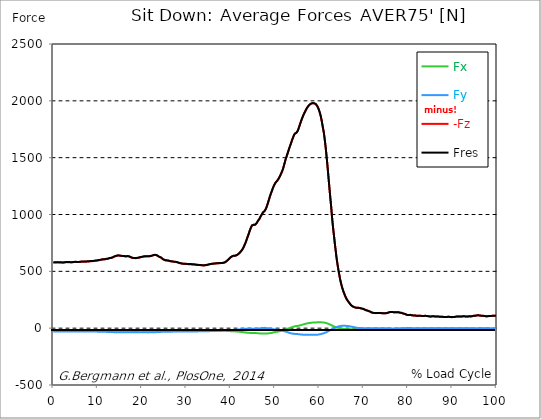
| Category |  Fx |  Fy |  -Fz |  Fres |
|---|---|---|---|---|
| 0.0 | -23.135 | -29.291 | 578.853 | 580.077 |
| 0.167348456675344 | -23.206 | -29.258 | 578.73 | 579.949 |
| 0.334696913350688 | -23.167 | -29.246 | 578.356 | 579.575 |
| 0.5020453700260321 | -23.077 | -29.213 | 578.099 | 579.31 |
| 0.669393826701376 | -22.89 | -29.162 | 578.066 | 579.272 |
| 0.83674228337672 | -23.167 | -29.033 | 578.988 | 580.193 |
| 1.0040907400520642 | -23.541 | -29.11 | 579.175 | 580.4 |
| 1.1621420602454444 | -23.322 | -29.265 | 578.279 | 579.51 |
| 1.3294905169207885 | -23.418 | -29.284 | 577.989 | 579.22 |
| 1.4968389735961325 | -23.444 | -29.188 | 577.892 | 579.123 |
| 1.6641874302714765 | -23.47 | -29.2 | 577.931 | 579.156 |
| 1.8315358869468206 | -23.464 | -29.355 | 577.802 | 579.04 |
| 1.9988843436221646 | -23.302 | -29.51 | 577.119 | 578.356 |
| 2.1662328002975086 | -23.257 | -29.4 | 577.138 | 578.369 |
| 2.333581256972853 | -23.238 | -29.258 | 577.241 | 578.46 |
| 2.5009297136481967 | -23.257 | -29.104 | 578.273 | 579.484 |
| 2.6682781703235405 | -23.277 | -28.949 | 579.317 | 580.522 |
| 2.8356266269988843 | -23.425 | -28.91 | 580.226 | 581.431 |
| 3.002975083674229 | -23.638 | -28.923 | 581.07 | 582.282 |
| 3.1703235403495724 | -23.592 | -28.91 | 581.238 | 582.45 |
| 3.337671997024917 | -23.431 | -28.904 | 580.754 | 581.96 |
| 3.4957233172182973 | -23.386 | -28.794 | 580.322 | 581.521 |
| 3.663071773893641 | -23.315 | -28.769 | 579.91 | 581.102 |
| 3.8304202305689854 | -23.186 | -28.704 | 579.562 | 580.748 |
| 3.997768687244329 | -23.057 | -28.582 | 579.336 | 580.509 |
| 4.165117143919673 | -23.019 | -28.517 | 579.414 | 580.587 |
| 4.332465600595017 | -23.083 | -28.53 | 579.91 | 581.083 |
| 4.499814057270361 | -23.193 | -28.562 | 580.567 | 581.747 |
| 4.667162513945706 | -23.393 | -28.627 | 581.644 | 582.83 |
| 4.834510970621049 | -23.592 | -28.691 | 582.72 | 583.919 |
| 5.001859427296393 | -23.644 | -28.794 | 583.107 | 584.313 |
| 5.169207883971737 | -23.567 | -28.943 | 582.617 | 583.823 |
| 5.336556340647081 | -23.264 | -29.007 | 581.67 | 582.869 |
| 5.503904797322425 | -22.967 | -29.007 | 581.089 | 582.282 |
| 5.671253253997769 | -22.954 | -29.039 | 581.496 | 582.688 |
| 5.82930457419115 | -22.909 | -29.014 | 582.011 | 583.197 |
| 5.996653030866494 | -22.89 | -28.962 | 582.662 | 583.842 |
| 6.164001487541838 | -23.032 | -28.788 | 583.977 | 585.157 |
| 6.331349944217181 | -23.322 | -28.775 | 585.144 | 586.33 |
| 6.498698400892526 | -23.412 | -29.039 | 585.131 | 586.33 |
| 6.66604685756787 | -23.244 | -29.194 | 584.545 | 585.744 |
| 6.833395314243213 | -23.386 | -29.136 | 585.138 | 586.343 |
| 7.000743770918558 | -23.612 | -29.226 | 585.698 | 586.917 |
| 7.168092227593902 | -23.335 | -29.478 | 585.144 | 586.362 |
| 7.335440684269246 | -22.967 | -29.568 | 584.764 | 585.976 |
| 7.50278914094459 | -22.999 | -29.4 | 585.93 | 587.129 |
| 7.6701375976199335 | -23.347 | -29.323 | 587.013 | 588.225 |
| 7.837486054295278 | -23.212 | -29.413 | 586.852 | 588.058 |
| 7.995537374488658 | -22.722 | -29.439 | 586.407 | 587.6 |
| 8.162885831164003 | -22.503 | -29.342 | 587.187 | 588.361 |
| 8.330234287839346 | -22.716 | -29.297 | 589.192 | 590.372 |
| 8.49758274451469 | -22.941 | -29.31 | 589.888 | 591.074 |
| 8.664931201190035 | -22.6 | -29.452 | 589.521 | 590.701 |
| 8.832279657865378 | -22.097 | -29.6 | 589.366 | 590.533 |
| 8.999628114540721 | -22.033 | -29.632 | 590.314 | 591.48 |
| 9.166976571216066 | -22.548 | -29.652 | 592.015 | 593.202 |
| 9.334325027891412 | -22.735 | -29.884 | 592.815 | 594.02 |
| 9.501673484566755 | -22.406 | -30.187 | 592.97 | 594.181 |
| 9.669021941242098 | -22.149 | -30.341 | 593.434 | 594.639 |
| 9.836370397917442 | -22.284 | -30.387 | 594.742 | 595.954 |
| 10.003718854592787 | -22.619 | -30.496 | 596.341 | 597.572 |
| 10.17106731126813 | -22.916 | -30.786 | 597.43 | 598.681 |
| 10.329118631461512 | -22.961 | -31.167 | 597.965 | 599.241 |
| 10.496467088136853 | -22.651 | -31.515 | 598.694 | 599.983 |
| 10.663815544812199 | -22.574 | -31.663 | 600.795 | 602.084 |
| 10.831164001487544 | -22.677 | -31.76 | 603 | 604.295 |
| 10.998512458162887 | -22.658 | -32.101 | 603.87 | 605.185 |
| 11.16586091483823 | -22.374 | -32.269 | 604.037 | 605.359 |
| 11.333209371513574 | -22.31 | -32.449 | 604.85 | 606.171 |
| 11.50055782818892 | -22.342 | -32.552 | 604.682 | 606.016 |
| 11.667906284864264 | -22.161 | -32.365 | 605.849 | 607.164 |
| 11.835254741539607 | -22.419 | -32.327 | 607.724 | 609.039 |
| 12.00260319821495 | -22.638 | -32.72 | 609.265 | 610.612 |
| 12.169951654890292 | -22.303 | -33.158 | 609.31 | 610.67 |
| 12.337300111565641 | -22 | -33.371 | 610.496 | 611.856 |
| 12.504648568240984 | -22.174 | -33.532 | 613.532 | 614.905 |
| 12.662699888434362 | -22.335 | -33.842 | 616.046 | 617.439 |
| 12.830048345109708 | -22.381 | -34.106 | 617.091 | 618.502 |
| 12.997396801785053 | -22.013 | -34.138 | 617.29 | 618.689 |
| 13.164745258460396 | -21.974 | -34.19 | 619.469 | 620.868 |
| 13.33209371513574 | -21.962 | -34.454 | 621.061 | 622.473 |
| 13.499442171811083 | -21.865 | -34.718 | 623.936 | 625.361 |
| 13.666790628486426 | -21.665 | -34.912 | 627.952 | 629.37 |
| 13.834139085161771 | -21.826 | -35.015 | 631.51 | 632.935 |
| 14.001487541837117 | -21.839 | -35.318 | 633.296 | 634.733 |
| 14.16883599851246 | -21.71 | -35.601 | 635.139 | 636.583 |
| 14.336184455187803 | -21.736 | -35.814 | 636.964 | 638.42 |
| 14.503532911863147 | -22.103 | -35.763 | 638.891 | 640.361 |
| 14.670881368538492 | -22.277 | -35.627 | 639.484 | 640.954 |
| 14.828932688731873 | -22.161 | -35.55 | 638.936 | 640.399 |
| 14.996281145407215 | -22.245 | -35.479 | 637.312 | 638.775 |
| 15.163629602082558 | -22.194 | -35.485 | 636.719 | 638.182 |
| 15.330978058757903 | -22.265 | -35.601 | 635.249 | 636.719 |
| 15.498326515433247 | -22.045 | -35.518 | 633.689 | 635.159 |
| 15.665674972108594 | -22.335 | -35.163 | 634.114 | 635.578 |
| 15.833023428783937 | -22.638 | -35.131 | 634.359 | 635.829 |
| 16.00037188545928 | -22.735 | -35.286 | 633.302 | 634.785 |
| 16.167720342134626 | -22.716 | -35.369 | 631.852 | 633.341 |
| 16.335068798809967 | -22.49 | -35.279 | 630.859 | 632.342 |
| 16.502417255485312 | -22.664 | -35.021 | 631.626 | 633.096 |
| 16.669765712160658 | -23.07 | -34.995 | 632.471 | 633.947 |
| 16.837114168836 | -23.315 | -35.028 | 632.342 | 633.837 |
| 17.004462625511344 | -23.618 | -34.995 | 632.09 | 633.599 |
| 17.16251394570472 | -23.76 | -35.318 | 629.647 | 631.175 |
| 17.32986240238007 | -23.58 | -35.659 | 626.154 | 627.694 |
| 17.497210859055414 | -23.399 | -35.995 | 622.641 | 624.2 |
| 17.664559315730756 | -23.302 | -36.207 | 620.165 | 621.725 |
| 17.8319077724061 | -23.824 | -36.201 | 618.077 | 619.662 |
| 17.999256229081443 | -24.115 | -36.233 | 616.549 | 618.154 |
| 18.166604685756788 | -24.134 | -36.285 | 616.794 | 618.406 |
| 18.333953142432133 | -24.205 | -36.265 | 616.207 | 617.825 |
| 18.501301599107478 | -24.089 | -36.098 | 615.84 | 617.439 |
| 18.668650055782823 | -24.057 | -36.001 | 615.827 | 617.426 |
| 18.835998512458165 | -24.024 | -35.949 | 616.459 | 618.045 |
| 19.00334696913351 | -23.799 | -35.982 | 617.593 | 619.173 |
| 19.170695425808855 | -23.496 | -36.201 | 618.702 | 620.281 |
| 19.338043882484197 | -23.238 | -36.394 | 619.965 | 621.538 |
| 19.496095202677576 | -23.302 | -36.42 | 622.473 | 624.046 |
| 19.66344365935292 | -23.464 | -36.517 | 624.355 | 625.934 |
| 19.830792116028263 | -23.154 | -36.768 | 625.29 | 626.869 |
| 19.998140572703612 | -22.767 | -36.671 | 626.347 | 627.894 |
| 20.165489029378953 | -22.742 | -36.51 | 628.3 | 629.834 |
| 20.3328374860543 | -22.709 | -36.459 | 629.963 | 631.497 |
| 20.500185942729644 | -22.49 | -36.491 | 631.059 | 632.587 |
| 20.667534399404985 | -22.252 | -36.742 | 630.447 | 631.981 |
| 20.83488285608033 | -22.026 | -36.858 | 630.647 | 632.168 |
| 21.002231312755672 | -22.11 | -36.775 | 632.271 | 633.792 |
| 21.16957976943102 | -22.271 | -36.8 | 632.961 | 634.488 |
| 21.336928226106362 | -22.194 | -37.058 | 632.226 | 633.766 |
| 21.504276682781704 | -21.962 | -37.174 | 631.169 | 632.709 |
| 21.67162513945705 | -21.916 | -36.987 | 631.781 | 633.309 |
| 21.82967645965043 | -22.219 | -36.768 | 633.347 | 634.869 |
| 21.997024916325774 | -22.297 | -36.82 | 634.23 | 635.745 |
| 22.16437337300112 | -22.632 | -36.697 | 635.629 | 637.151 |
| 22.33172182967646 | -22.819 | -36.497 | 638.221 | 639.735 |
| 22.499070286351806 | -22.819 | -36.31 | 641.186 | 642.688 |
| 22.666418743027148 | -22.593 | -35.988 | 643.004 | 644.48 |
| 22.833767199702496 | -22.477 | -35.924 | 643.468 | 644.937 |
| 23.00111565637784 | -22.587 | -35.363 | 643.674 | 645.124 |
| 23.168464113053183 | -22.6 | -34.905 | 643.165 | 644.602 |
| 23.335812569728528 | -22.497 | -34.615 | 640.786 | 642.217 |
| 23.50316102640387 | -22.413 | -34.267 | 637.621 | 639.046 |
| 23.670509483079215 | -22.239 | -33.751 | 632.026 | 633.425 |
| 23.83785793975456 | -21.936 | -33.494 | 628.042 | 629.422 |
| 23.995909259947936 | -22.2 | -33.081 | 624.903 | 626.283 |
| 24.163257716623285 | -22.632 | -32.9 | 622.956 | 624.349 |
| 24.330606173298627 | -22.684 | -32.656 | 619.521 | 620.919 |
| 24.49795462997397 | -22.529 | -32.237 | 613.474 | 614.86 |
| 24.665303086649313 | -22.426 | -31.785 | 607.48 | 608.853 |
| 24.83265154332466 | -22.51 | -31.418 | 603.799 | 605.159 |
| 25.0 | -22.78 | -31.244 | 601.208 | 602.568 |
| 25.167348456675345 | -22.935 | -31.173 | 597.836 | 599.203 |
| 25.334696913350694 | -22.974 | -31.231 | 595.548 | 596.921 |
| 25.502045370026035 | -23.161 | -31.089 | 594.936 | 596.309 |
| 25.669393826701377 | -23.238 | -31.134 | 594.987 | 596.367 |
| 25.836742283376722 | -23.399 | -31.121 | 594.594 | 595.986 |
| 26.004090740052067 | -23.393 | -31.096 | 593.272 | 594.658 |
| 26.17143919672741 | -23.315 | -31.147 | 590.868 | 592.254 |
| 26.329490516920792 | -23.257 | -31.128 | 588.689 | 590.082 |
| 26.49683897359613 | -23.219 | -30.87 | 587.626 | 589.005 |
| 26.66418743027148 | -23.283 | -30.702 | 586.936 | 588.309 |
| 26.831535886946828 | -23.367 | -30.593 | 586.298 | 587.664 |
| 26.998884343622166 | -23.483 | -30.361 | 585.447 | 586.814 |
| 27.166232800297514 | -23.541 | -30.283 | 584.158 | 585.524 |
| 27.333581256972852 | -23.496 | -30.341 | 583.159 | 584.532 |
| 27.5009297136482 | -23.625 | -30.432 | 582.643 | 584.029 |
| 27.668278170323543 | -23.728 | -30.483 | 581.947 | 583.333 |
| 27.835626626998888 | -23.696 | -30.445 | 580.625 | 582.011 |
| 28.002975083674233 | -23.67 | -30.374 | 578.911 | 580.29 |
| 28.170323540349575 | -23.65 | -30.264 | 576.784 | 578.163 |
| 28.33767199702492 | -23.438 | -30.167 | 573.973 | 575.34 |
| 28.50502045370026 | -23.412 | -29.935 | 571.994 | 573.348 |
| 28.663071773893645 | -23.592 | -29.723 | 570.615 | 571.968 |
| 28.830420230568986 | -23.644 | -29.71 | 569.068 | 570.421 |
| 28.99776868724433 | -23.605 | -29.684 | 567.701 | 569.055 |
| 29.165117143919673 | -23.496 | -29.639 | 566.47 | 567.824 |
| 29.33246560059502 | -23.483 | -29.594 | 565.967 | 567.314 |
| 29.499814057270367 | -23.515 | -29.516 | 565.754 | 567.102 |
| 29.66716251394571 | -23.58 | -29.375 | 565.606 | 566.947 |
| 29.834510970621054 | -23.663 | -29.323 | 565.335 | 566.683 |
| 30.00185942729639 | -23.741 | -29.291 | 565.039 | 566.386 |
| 30.169207883971744 | -23.766 | -29.329 | 563.924 | 565.284 |
| 30.33655634064708 | -23.779 | -29.342 | 562.918 | 564.278 |
| 30.50390479732243 | -23.792 | -29.304 | 562.306 | 563.666 |
| 30.671253253997772 | -23.844 | -29.246 | 562.022 | 563.376 |
| 30.829304574191156 | -23.96 | -29.142 | 562.183 | 563.537 |
| 30.996653030866494 | -24.069 | -29.046 | 562.351 | 563.698 |
| 31.164001487541842 | -24.211 | -28.936 | 561.648 | 562.996 |
| 31.331349944217187 | -24.34 | -28.833 | 560.926 | 562.28 |
| 31.498698400892525 | -24.36 | -28.846 | 560.63 | 561.983 |
| 31.666046857567874 | -24.379 | -28.859 | 560.333 | 561.687 |
| 31.833395314243212 | -24.379 | -28.852 | 559.889 | 561.242 |
| 32.00074377091856 | -24.327 | -28.756 | 558.922 | 560.269 |
| 32.1680922275939 | -24.276 | -28.659 | 557.955 | 559.295 |
| 32.33544068426925 | -24.237 | -28.504 | 556.923 | 558.258 |
| 32.50278914094459 | -24.237 | -28.266 | 555.808 | 557.123 |
| 32.670137597619934 | -24.418 | -28.072 | 555.634 | 556.949 |
| 32.83748605429528 | -24.598 | -27.885 | 555.46 | 556.782 |
| 33.004834510970625 | -24.759 | -27.718 | 555.189 | 556.511 |
| 33.162885831164004 | -24.837 | -27.705 | 554.39 | 555.718 |
| 33.33023428783935 | -24.907 | -27.686 | 553.597 | 554.919 |
| 33.497582744514695 | -24.978 | -27.673 | 552.798 | 554.126 |
| 33.664931201190036 | -24.94 | -27.634 | 552.392 | 553.713 |
| 33.83227965786538 | -24.83 | -27.589 | 552.192 | 553.507 |
| 33.99962811454073 | -24.727 | -27.544 | 551.992 | 553.301 |
| 34.16697657121607 | -24.624 | -27.454 | 552.34 | 553.629 |
| 34.33432502789141 | -24.521 | -27.305 | 553.668 | 554.944 |
| 34.50167348456676 | -24.411 | -27.151 | 554.996 | 556.253 |
| 34.6690219412421 | -24.501 | -26.906 | 556.285 | 557.529 |
| 34.83637039791744 | -24.682 | -26.616 | 557.555 | 558.786 |
| 35.00371885459279 | -24.791 | -26.371 | 559.115 | 560.333 |
| 35.17106731126814 | -24.804 | -26.177 | 561.094 | 562.293 |
| 35.338415767943474 | -24.785 | -25.965 | 562.725 | 563.904 |
| 35.49646708813686 | -24.727 | -25.745 | 564.098 | 565.258 |
| 35.6638155448122 | -24.566 | -25.539 | 565.29 | 566.431 |
| 35.831164001487544 | -24.269 | -25.281 | 565.89 | 567.005 |
| 35.998512458162885 | -23.973 | -25.023 | 566.502 | 567.585 |
| 36.165860914838234 | -23.689 | -24.798 | 567.334 | 568.397 |
| 36.333209371513576 | -23.502 | -24.592 | 567.978 | 569.023 |
| 36.50055782818892 | -23.393 | -24.398 | 568.513 | 569.545 |
| 36.667906284864266 | -23.27 | -24.192 | 569.39 | 570.402 |
| 36.83525474153961 | -23.09 | -24.011 | 569.783 | 570.782 |
| 37.002603198214956 | -23.09 | -23.689 | 570.415 | 571.395 |
| 37.1699516548903 | -23.103 | -23.354 | 571.066 | 572.026 |
| 37.337300111565646 | -23.109 | -23.077 | 571.408 | 572.355 |
| 37.50464856824098 | -23.122 | -22.812 | 571.678 | 572.613 |
| 37.66269988843437 | -22.987 | -22.516 | 571.955 | 572.871 |
| 37.83004834510971 | -22.825 | -22.207 | 572.155 | 573.058 |
| 37.99739680178505 | -22.78 | -21.865 | 572.851 | 573.735 |
| 38.16474525846039 | -22.819 | -21.53 | 573.986 | 574.856 |
| 38.33209371513574 | -22.806 | -21.485 | 574.579 | 575.443 |
| 38.49944217181109 | -22.8 | -21.478 | 575.224 | 576.087 |
| 38.666790628486424 | -23.077 | -21.323 | 577.828 | 578.698 |
| 38.83413908516178 | -23.451 | -21.13 | 581.489 | 582.359 |
| 39.001487541837115 | -23.986 | -20.711 | 586.652 | 587.529 |
| 39.16883599851246 | -24.546 | -20.124 | 591.945 | 592.821 |
| 39.336184455187805 | -24.914 | -19.738 | 597.985 | 598.861 |
| 39.503532911863154 | -25.288 | -19.274 | 603.96 | 604.824 |
| 39.670881368538495 | -25.713 | -18.687 | 610.064 | 610.928 |
| 39.83822982521384 | -26.074 | -18.461 | 616.581 | 617.445 |
| 39.996281145407224 | -26.306 | -17.92 | 623.388 | 624.239 |
| 40.163629602082565 | -26.68 | -17.282 | 628.481 | 629.325 |
| 40.33097805875791 | -27.06 | -16.695 | 631.974 | 632.806 |
| 40.498326515433256 | -27.286 | -16.134 | 634.733 | 635.558 |
| 40.6656749721086 | -27.434 | -15.561 | 636.558 | 637.376 |
| 40.83302342878393 | -27.57 | -15 | 636.235 | 637.041 |
| 41.00037188545929 | -28.04 | -14.439 | 637.047 | 637.86 |
| 41.16772034213463 | -28.549 | -13.717 | 639.291 | 640.116 |
| 41.33506879880997 | -28.723 | -13.434 | 641.289 | 642.12 |
| 41.50241725548531 | -29.226 | -12.866 | 645.086 | 645.93 |
| 41.66976571216066 | -29.864 | -12.273 | 649.656 | 650.52 |
| 41.837114168836 | -30.748 | -11.513 | 655.348 | 656.237 |
| 42.004462625511344 | -31.534 | -10.862 | 661.272 | 662.187 |
| 42.17181108218669 | -32.172 | -10.262 | 667.647 | 668.568 |
| 42.32986240238007 | -32.778 | -9.418 | 675.84 | 676.768 |
| 42.497210859055414 | -33.377 | -8.483 | 683.736 | 684.664 |
| 42.66455931573076 | -34.151 | -7.735 | 693.237 | 694.178 |
| 42.831907772406105 | -35.273 | -7.123 | 704.982 | 705.962 |
| 42.999256229081446 | -36.484 | -6.672 | 719.073 | 720.091 |
| 43.16660468575679 | -37.516 | -6.253 | 734.157 | 735.201 |
| 43.33395314243214 | -38.283 | -5.866 | 748.68 | 749.743 |
| 43.50130159910748 | -39.127 | -5.724 | 766.529 | 767.612 |
| 43.66865005578282 | -39.907 | -5.776 | 785.1 | 786.202 |
| 43.83599851245817 | -40.365 | -5.479 | 803.819 | 804.908 |
| 44.00334696913351 | -40.913 | -5.324 | 820.972 | 822.074 |
| 44.17069542580886 | -41.461 | -5.376 | 840.922 | 842.024 |
| 44.3380438824842 | -41.802 | -5.408 | 860.57 | 861.659 |
| 44.49609520267758 | -41.886 | -5.324 | 876.807 | 877.877 |
| 44.66344365935292 | -41.699 | -5.047 | 892.761 | 893.805 |
| 44.83079211602827 | -41.674 | -4.951 | 903.822 | 904.854 |
| 44.99814057270361 | -42.041 | -4.931 | 909.218 | 910.256 |
| 45.16548902937895 | -42.118 | -4.718 | 908.812 | 909.849 |
| 45.332837486054295 | -42.395 | -4.351 | 907.2 | 908.244 |
| 45.500185942729644 | -42.731 | -4.28 | 908.902 | 909.953 |
| 45.66753439940499 | -43.092 | -4.306 | 912.886 | 913.949 |
| 45.83488285608033 | -43.343 | -4.345 | 922.542 | 923.612 |
| 46.00223131275568 | -44.194 | -4.699 | 933.158 | 934.254 |
| 46.16957976943102 | -44.839 | -4.403 | 943.968 | 945.09 |
| 46.336928226106366 | -45.554 | -3.687 | 951.51 | 952.658 |
| 46.50427668278171 | -46.115 | -2.617 | 961.456 | 962.636 |
| 46.671625139457056 | -46.347 | -1.528 | 975.451 | 976.643 |
| 46.829676459650436 | -46.476 | -0.348 | 987.614 | 988.839 |
| 46.99702491632577 | -46.656 | 0.922 | 998.089 | 999.346 |
| 47.16437337300112 | -46.695 | 1.992 | 1009.202 | 1010.478 |
| 47.33172182967646 | -46.727 | 2.424 | 1019.245 | 1020.528 |
| 47.49907028635181 | -46.888 | 2.598 | 1024.698 | 1025.981 |
| 47.66641874302716 | -47.12 | 2.617 | 1030.351 | 1031.621 |
| 47.83376719970249 | -47.359 | 1.876 | 1041.664 | 1042.921 |
| 48.001115656377834 | -47.481 | 0.844 | 1054.498 | 1055.723 |
| 48.16846411305319 | -47.372 | -0.316 | 1072.109 | 1073.308 |
| 48.33581256972853 | -46.637 | -1.186 | 1092.207 | 1093.348 |
| 48.50316102640387 | -45.715 | -2.005 | 1112.635 | 1113.705 |
| 48.67050948307921 | -44.664 | -2.946 | 1134.293 | 1135.312 |
| 48.837857939754564 | -44.001 | -4.08 | 1155.894 | 1156.887 |
| 49.005206396429905 | -43.317 | -5.756 | 1175.6 | 1176.547 |
| 49.163257716623285 | -42.26 | -7.29 | 1193.358 | 1194.241 |
| 49.33060617329863 | -40.977 | -8.702 | 1210.079 | 1210.892 |
| 49.49795462997397 | -39.334 | -9.585 | 1229.617 | 1230.378 |
| 49.66530308664932 | -37.368 | -10.107 | 1245.346 | 1246.048 |
| 49.832651543324666 | -35.679 | -10.513 | 1259.159 | 1259.81 |
| 50.0 | -34.273 | -10.913 | 1272.651 | 1273.27 |
| 50.16734845667534 | -33.268 | -11.145 | 1281.495 | 1282.088 |
| 50.33469691335069 | -32.359 | -11.351 | 1288.521 | 1289.088 |
| 50.50204537002604 | -31.373 | -11.983 | 1296.669 | 1297.204 |
| 50.66939382670139 | -30.122 | -12.847 | 1305.951 | 1306.454 |
| 50.836742283376715 | -28.588 | -13.956 | 1316.465 | 1316.922 |
| 51.00409074005207 | -27.164 | -15.161 | 1327.751 | 1328.183 |
| 51.17143919672741 | -25.797 | -16.573 | 1340.837 | 1341.249 |
| 51.32949051692079 | -24.308 | -18.236 | 1356.03 | 1356.423 |
| 51.496838973596134 | -22.393 | -20.473 | 1370.553 | 1370.933 |
| 51.66418743027148 | -20.576 | -22.451 | 1386.268 | 1386.636 |
| 51.831535886946824 | -18.919 | -24.024 | 1404.685 | 1405.046 |
| 51.99888434362217 | -17.25 | -25.739 | 1427.291 | 1427.652 |
| 52.16623280029752 | -15.051 | -27.589 | 1451.953 | 1452.321 |
| 52.33358125697285 | -12.467 | -29.433 | 1476.558 | 1476.945 |
| 52.5009297136482 | -10.03 | -31.386 | 1497.256 | 1497.649 |
| 52.668278170323546 | -7.6 | -33.403 | 1516.826 | 1517.239 |
| 52.835626626998895 | -5.279 | -35.537 | 1536.409 | 1536.854 |
| 53.00297508367424 | -3.217 | -37.857 | 1556.392 | 1556.875 |
| 53.17032354034958 | -1.044 | -40.184 | 1576.742 | 1577.283 |
| 53.33767199702492 | 1.379 | -42.241 | 1596.854 | 1597.44 |
| 53.50502045370027 | 3.61 | -44.22 | 1613.819 | 1614.458 |
| 53.663071773893655 | 5.937 | -45.928 | 1632.539 | 1633.228 |
| 53.83042023056899 | 8.27 | -47.159 | 1651.877 | 1652.605 |
| 53.99776868724433 | 10.61 | -48.184 | 1670.125 | 1670.893 |
| 54.16511714391967 | 12.866 | -49.08 | 1686.666 | 1687.459 |
| 54.33246560059503 | 15.019 | -49.944 | 1701.202 | 1702.033 |
| 54.49981405727037 | 16.94 | -50.395 | 1711.354 | 1712.205 |
| 54.667162513945705 | 18.358 | -50.808 | 1715.641 | 1716.517 |
| 54.834510970621054 | 18.449 | -51.252 | 1718.451 | 1719.341 |
| 55.0018594272964 | 18.661 | -51.762 | 1723.163 | 1724.066 |
| 55.169207883971744 | 19.577 | -52.606 | 1738.299 | 1739.233 |
| 55.336556340647086 | 21.207 | -53.251 | 1757.63 | 1758.591 |
| 55.50390479732243 | 22.948 | -54.417 | 1776.311 | 1777.316 |
| 55.671253253997776 | 24.907 | -55.152 | 1796.377 | 1797.421 |
| 55.83860171067312 | 26.596 | -55.623 | 1815.896 | 1816.966 |
| 55.9966530308665 | 28.395 | -56.132 | 1832.771 | 1833.874 |
| 56.16400148754184 | 30.515 | -56.693 | 1851.014 | 1852.155 |
| 56.33134994421718 | 32.546 | -57.163 | 1866.271 | 1867.451 |
| 56.498698400892536 | 34.718 | -57.453 | 1881.658 | 1882.876 |
| 56.66604685756788 | 36.517 | -57.756 | 1895.575 | 1896.819 |
| 56.83339531424321 | 38.109 | -57.776 | 1908.396 | 1909.666 |
| 57.00074377091856 | 39.791 | -57.789 | 1921.482 | 1922.777 |
| 57.16809222759391 | 41.358 | -58.066 | 1933.407 | 1934.735 |
| 57.33544068426925 | 42.621 | -58.433 | 1943.102 | 1944.462 |
| 57.5027891409446 | 43.885 | -58.775 | 1952.597 | 1953.989 |
| 57.670137597619934 | 45.058 | -59.065 | 1960.441 | 1961.866 |
| 57.83748605429528 | 46.095 | -59.149 | 1966.552 | 1967.996 |
| 58.004834510970625 | 47.017 | -58.652 | 1970.62 | 1972.07 |
| 58.16288583116401 | 47.759 | -58.311 | 1975.048 | 1976.498 |
| 58.330234287839346 | 48.551 | -58.137 | 1978.091 | 1979.554 |
| 58.497582744514695 | 49.499 | -58.278 | 1978.755 | 1980.25 |
| 58.66493120119004 | 49.641 | -58.285 | 1978.252 | 1979.747 |
| 58.832279657865385 | 49.892 | -58.33 | 1977.452 | 1978.961 |
| 58.999628114540734 | 50.221 | -58.356 | 1976.492 | 1978.013 |
| 59.16697657121607 | 50.517 | -58.298 | 1971.812 | 1973.34 |
| 59.33432502789142 | 50.924 | -58.182 | 1964.541 | 1966.082 |
| 59.50167348456676 | 51.181 | -57.782 | 1954.943 | 1956.484 |
| 59.66902194124211 | 51.452 | -57.054 | 1942.734 | 1944.268 |
| 59.83637039791745 | 51.697 | -56.113 | 1927.489 | 1929.017 |
| 60.00371885459278 | 51.839 | -54.92 | 1908.77 | 1910.278 |
| 60.17106731126813 | 51.646 | -53.438 | 1886.963 | 1888.439 |
| 60.33841576794349 | 51.633 | -52.058 | 1861.966 | 1863.422 |
| 60.49646708813685 | 51.459 | -50.35 | 1830.625 | 1832.056 |
| 60.6638155448122 | 50.975 | -48.545 | 1795.256 | 1796.654 |
| 60.831164001487544 | 50.427 | -46.766 | 1757.965 | 1759.326 |
| 60.99851245816289 | 49.621 | -45.013 | 1723.447 | 1724.768 |
| 61.16586091483824 | 48.59 | -42.544 | 1676.314 | 1677.577 |
| 61.333209371513576 | 47.327 | -39.74 | 1622.418 | 1623.617 |
| 61.50055782818892 | 45.805 | -36.903 | 1563.541 | 1564.675 |
| 61.667906284864266 | 43.723 | -33.822 | 1498.59 | 1499.641 |
| 61.835254741539615 | 41.28 | -30.445 | 1429.882 | 1430.836 |
| 62.002603198214956 | 38.702 | -26.725 | 1355.373 | 1356.224 |
| 62.16995165489029 | 36.053 | -23.083 | 1281.953 | 1282.707 |
| 62.33730011156564 | 33.216 | -19.583 | 1209.19 | 1209.847 |
| 62.504648568240995 | 30.322 | -16.25 | 1137.671 | 1138.226 |
| 62.67199702491633 | 27.531 | -13.285 | 1070.555 | 1071.039 |
| 62.83004834510971 | 23.863 | -9.592 | 991.044 | 991.43 |
| 62.99739680178505 | 20.608 | -6.24 | 922.561 | 922.877 |
| 63.1647452584604 | 17.701 | -3.075 | 860.292 | 860.544 |
| 63.33209371513575 | 15.039 | -0.258 | 803.129 | 803.342 |
| 63.4994421718111 | 12.486 | 2.836 | 744.741 | 744.922 |
| 63.666790628486424 | 9.914 | 5.647 | 689.64 | 689.808 |
| 63.83413908516177 | 7.168 | 8.38 | 634.727 | 634.907 |
| 64.00148754183712 | 5.228 | 11.3 | 586.717 | 586.923 |
| 64.16883599851248 | 3.481 | 13.337 | 545.198 | 545.437 |
| 64.3361844551878 | 1.657 | 15.013 | 505.671 | 505.961 |
| 64.50353291186315 | 0.187 | 16.65 | 470.476 | 470.837 |
| 64.6708813685385 | -1.251 | 18.345 | 434.036 | 434.501 |
| 64.83822982521384 | -2.566 | 19.403 | 405.506 | 406.048 |
| 65.00557828188919 | -3.745 | 20.228 | 378.046 | 378.684 |
| 65.16362960208257 | -4.764 | 20.614 | 355.659 | 356.355 |
| 65.3309780587579 | -5.692 | 20.917 | 334.22 | 334.987 |
| 65.49832651543326 | -6.478 | 21.02 | 315.707 | 316.532 |
| 65.6656749721086 | -7.129 | 20.917 | 298.728 | 299.605 |
| 65.83302342878395 | -7.845 | 20.698 | 282.194 | 283.135 |
| 66.00037188545929 | -8.509 | 20.299 | 268.013 | 268.999 |
| 66.16772034213463 | -9.16 | 19.86 | 255.482 | 256.513 |
| 66.33506879880998 | -9.753 | 19.228 | 244.678 | 245.729 |
| 66.50241725548531 | -10.043 | 18.423 | 235.447 | 236.485 |
| 66.66976571216065 | -10.249 | 17.475 | 226.739 | 227.751 |
| 66.83711416883601 | -10.436 | 16.495 | 218.494 | 219.487 |
| 67.00446262551135 | -10.501 | 15.509 | 209.728 | 210.701 |
| 67.1718110821867 | -10.165 | 14.123 | 201.367 | 202.25 |
| 67.32986240238007 | -10.043 | 12.782 | 195.785 | 196.597 |
| 67.49721085905541 | -9.966 | 11.313 | 191.492 | 192.214 |
| 67.66455931573076 | -10.107 | 10.082 | 188.43 | 189.094 |
| 67.83190777240611 | -9.901 | 8.934 | 185.761 | 186.367 |
| 67.99925622908145 | -9.514 | 7.316 | 182.674 | 183.189 |
| 68.16660468575678 | -9.437 | 5.789 | 180.65 | 181.127 |
| 68.33395314243214 | -9.508 | 4.377 | 179.451 | 179.889 |
| 68.50130159910749 | -9.501 | 3.32 | 179.109 | 179.528 |
| 68.66865005578282 | -9.585 | 2.366 | 179.361 | 179.773 |
| 68.83599851245816 | -9.598 | 1.618 | 179.483 | 179.896 |
| 69.00334696913352 | -9.379 | 1.006 | 178.226 | 178.632 |
| 69.17069542580886 | -9.211 | 0.548 | 176.324 | 176.731 |
| 69.3380438824842 | -8.921 | 0.116 | 174.223 | 174.636 |
| 69.50539233915956 | -8.683 | -0.4 | 172.676 | 173.089 |
| 69.66344365935292 | -8.741 | -0.657 | 172.025 | 172.438 |
| 69.83079211602826 | -8.734 | -0.774 | 170.562 | 170.981 |
| 69.99814057270362 | -8.554 | -0.754 | 167.5 | 167.919 |
| 70.16548902937896 | -8.386 | -0.574 | 164.515 | 164.934 |
| 70.33283748605429 | -8.07 | -0.909 | 160.686 | 161.093 |
| 70.50018594272964 | -7.987 | -1.141 | 158.172 | 158.559 |
| 70.667534399405 | -8.045 | -1.122 | 156.709 | 157.102 |
| 70.83488285608033 | -8.186 | -0.928 | 154.724 | 155.124 |
| 71.00223131275568 | -8.058 | -1.006 | 151.288 | 151.681 |
| 71.16957976943102 | -8.077 | -1.437 | 149.67 | 150.057 |
| 71.33692822610637 | -8.219 | -1.154 | 148.084 | 148.478 |
| 71.50427668278171 | -7.819 | -0.98 | 144.481 | 144.855 |
| 71.67162513945706 | -7.477 | -0.786 | 140.588 | 140.936 |
| 71.8389735961324 | -7.387 | -0.632 | 137.726 | 138.061 |
| 71.99702491632577 | -7.535 | -0.696 | 135.972 | 136.314 |
| 72.16437337300113 | -7.664 | -0.825 | 134.503 | 134.851 |
| 72.33172182967647 | -7.516 | -0.98 | 132.956 | 133.291 |
| 72.49907028635181 | -7.413 | -1.006 | 132.44 | 132.769 |
| 72.66641874302715 | -7.323 | -0.844 | 132.33 | 132.653 |
| 72.8337671997025 | -7.232 | -0.786 | 132.221 | 132.543 |
| 73.00111565637783 | -7.31 | -0.844 | 132.614 | 132.949 |
| 73.16846411305319 | -7.4 | -0.935 | 133.433 | 133.768 |
| 73.33581256972853 | -7.361 | -0.928 | 134.045 | 134.38 |
| 73.50316102640387 | -7.252 | -0.877 | 134.213 | 134.548 |
| 73.67050948307921 | -7.058 | -0.954 | 134.006 | 134.316 |
| 73.83785793975457 | -7.026 | -0.941 | 132.878 | 133.168 |
| 74.00520639642991 | -6.891 | -0.799 | 131.75 | 132.015 |
| 74.16325771662328 | -7.052 | -0.509 | 131.576 | 131.84 |
| 74.33060617329863 | -7.136 | -0.393 | 130.944 | 131.209 |
| 74.49795462997398 | -7.194 | -0.329 | 130.184 | 130.448 |
| 74.66530308664932 | -6.968 | -0.503 | 130.3 | 130.551 |
| 74.83265154332466 | -6.865 | -0.509 | 130.886 | 131.138 |
| 75.00000000000001 | -6.878 | -0.451 | 131.389 | 131.634 |
| 75.16734845667534 | -6.865 | -0.799 | 132.408 | 132.653 |
| 75.3346969133507 | -6.929 | -1.283 | 134.077 | 134.316 |
| 75.50204537002605 | -7.174 | -1.386 | 136.224 | 136.469 |
| 75.66939382670138 | -7.084 | -1.721 | 138.525 | 138.764 |
| 75.83674228337672 | -7.213 | -1.792 | 140.485 | 140.73 |
| 76.00409074005208 | -7.207 | -1.934 | 141.722 | 141.961 |
| 76.17143919672742 | -7.116 | -2.05 | 142.824 | 143.069 |
| 76.33878765340276 | -6.987 | -2.121 | 142.96 | 143.198 |
| 76.49683897359614 | -6.859 | -2.237 | 141.87 | 142.096 |
| 76.66418743027148 | -6.491 | -2.52 | 140.536 | 140.749 |
| 76.83153588694682 | -6.15 | -2.714 | 139.872 | 140.072 |
| 76.99888434362218 | -6.259 | -2.411 | 140.439 | 140.646 |
| 77.16623280029752 | -6.124 | -2.288 | 140.175 | 140.375 |
| 77.33358125697285 | -5.885 | -2.424 | 139.698 | 139.898 |
| 77.5009297136482 | -5.924 | -2.211 | 140.865 | 141.058 |
| 77.66827817032356 | -5.937 | -1.908 | 141.071 | 141.258 |
| 77.83562662699889 | -5.763 | -1.96 | 140.085 | 140.272 |
| 78.00297508367423 | -5.492 | -2.018 | 138.499 | 138.68 |
| 78.17032354034959 | -5.183 | -1.947 | 136.52 | 136.688 |
| 78.33767199702493 | -5.576 | -1.412 | 136.507 | 136.688 |
| 78.50502045370027 | -5.627 | -1.044 | 135.141 | 135.321 |
| 78.67236891037561 | -5.46 | -0.89 | 132.33 | 132.511 |
| 78.83042023056899 | -5.286 | -0.767 | 129.829 | 130.003 |
| 78.99776868724433 | -5.37 | -0.406 | 128.701 | 128.882 |
| 79.16511714391969 | -5.221 | -0.084 | 126.709 | 126.89 |
| 79.33246560059503 | -5.228 | 0.058 | 124.092 | 124.273 |
| 79.49981405727036 | -5.099 | 0.232 | 121.469 | 121.656 |
| 79.66716251394571 | -5.041 | 0.509 | 118.478 | 118.671 |
| 79.83451097062107 | -4.893 | 0.38 | 116.46 | 116.654 |
| 80.00185942729641 | -5.015 | 0.516 | 116.183 | 116.383 |
| 80.16920788397174 | -5.112 | 0.632 | 116.009 | 116.202 |
| 80.33655634064709 | -5.415 | 0.535 | 116.718 | 116.924 |
| 80.50390479732243 | -5.421 | 0.419 | 117.047 | 117.253 |
| 80.67125325399778 | -5.26 | 0.535 | 115.771 | 115.983 |
| 80.83860171067312 | -4.951 | 0.361 | 113.592 | 113.798 |
| 80.99665303086651 | -4.815 | 0.026 | 112.386 | 112.586 |
| 81.16400148754184 | -4.751 | -0.019 | 111.864 | 112.064 |
| 81.3313499442172 | -4.667 | -0.251 | 111.284 | 111.49 |
| 81.49869840089255 | -4.77 | -0.168 | 111.974 | 112.193 |
| 81.66604685756786 | -4.648 | -0.026 | 111.168 | 111.387 |
| 81.83339531424322 | -4.532 | 0.174 | 109.705 | 109.911 |
| 82.00074377091858 | -4.248 | 0.084 | 108.138 | 108.351 |
| 82.16809222759392 | -4.132 | -0.032 | 107.919 | 108.119 |
| 82.33544068426926 | -4.325 | -0.026 | 108.628 | 108.841 |
| 82.50278914094459 | -4.493 | 0.077 | 109.441 | 109.666 |
| 82.67013759761994 | -4.609 | 0.245 | 110.124 | 110.349 |
| 82.83748605429528 | -4.403 | 0.387 | 109.176 | 109.395 |
| 83.00483451097062 | -4.061 | 0.193 | 107.713 | 107.919 |
| 83.17218296764597 | -3.913 | 0.2 | 106.907 | 107.101 |
| 83.33023428783935 | -3.977 | 0.264 | 107.043 | 107.236 |
| 83.4975827445147 | -3.797 | 0.045 | 106.662 | 106.836 |
| 83.66493120119004 | -3.997 | 0.18 | 107.887 | 108.068 |
| 83.83227965786537 | -4.125 | 0.226 | 108.506 | 108.693 |
| 83.99962811454073 | -4.119 | 0.09 | 108.577 | 108.757 |
| 84.16697657121607 | -3.9 | -0.11 | 107.745 | 107.919 |
| 84.33432502789142 | -3.668 | -0.264 | 106.669 | 106.836 |
| 84.50167348456677 | -3.468 | -0.509 | 105.463 | 105.631 |
| 84.6690219412421 | -3.294 | -0.793 | 104.239 | 104.406 |
| 84.83637039791745 | -3.21 | -0.999 | 103.504 | 103.678 |
| 85.0037188545928 | -3.236 | -1.102 | 103.285 | 103.465 |
| 85.17106731126813 | -3.281 | -1.193 | 103.007 | 103.188 |
| 85.33841576794349 | -3.3 | -1.186 | 103.111 | 103.291 |
| 85.50576422461883 | -3.429 | -1.134 | 104.123 | 104.303 |
| 85.66381554481221 | -3.526 | -1.096 | 104.329 | 104.516 |
| 85.83116400148755 | -3.642 | -1.038 | 104.239 | 104.426 |
| 85.99851245816289 | -3.462 | -1.167 | 103.317 | 103.497 |
| 86.16586091483823 | -3.242 | -1.328 | 102.472 | 102.659 |
| 86.33320937151358 | -3.055 | -1.45 | 102.092 | 102.279 |
| 86.50055782818893 | -3.178 | -1.347 | 102.692 | 102.885 |
| 86.66790628486427 | -3.268 | -1.205 | 103.272 | 103.465 |
| 86.83525474153961 | -3.184 | -1.012 | 102.788 | 102.982 |
| 87.00260319821496 | -3.004 | -1.006 | 101.744 | 101.937 |
| 87.16995165489031 | -2.804 | -1.334 | 100.287 | 100.487 |
| 87.33730011156564 | -2.933 | -1.405 | 100.242 | 100.448 |
| 87.504648568241 | -2.804 | -1.302 | 100.661 | 100.861 |
| 87.67199702491634 | -2.611 | -1.212 | 100.539 | 100.726 |
| 87.83004834510972 | -2.411 | -1.141 | 99.933 | 100.126 |
| 87.99739680178506 | -2.192 | -1.186 | 98.482 | 98.669 |
| 88.1647452584604 | -2.043 | -1.225 | 97.773 | 97.967 |
| 88.33209371513574 | -1.985 | -1.173 | 97.541 | 97.735 |
| 88.49944217181108 | -1.927 | -1.076 | 97.567 | 97.754 |
| 88.66679062848644 | -1.863 | -1.044 | 97.954 | 98.141 |
| 88.83413908516178 | -1.998 | -0.928 | 98.895 | 99.095 |
| 89.00148754183712 | -2.23 | -0.67 | 99.868 | 100.074 |
| 89.16883599851246 | -2.437 | -0.406 | 100.352 | 100.558 |
| 89.33618445518782 | -2.488 | -0.355 | 100.029 | 100.236 |
| 89.50353291186315 | -2.417 | -0.309 | 98.759 | 98.966 |
| 89.6708813685385 | -2.379 | -0.309 | 97.786 | 97.992 |
| 89.83822982521386 | -2.34 | -0.309 | 96.813 | 97.019 |
| 90.00557828188919 | -2.424 | -0.122 | 97.09 | 97.283 |
| 90.16362960208257 | -2.514 | 0.058 | 97.419 | 97.612 |
| 90.3309780587579 | -2.688 | 0.09 | 98.244 | 98.444 |
| 90.49832651543326 | -2.81 | 0.084 | 99.011 | 99.224 |
| 90.66567497210859 | -2.791 | 0.006 | 99.881 | 100.1 |
| 90.83302342878395 | -2.881 | -0.019 | 101.248 | 101.467 |
| 91.00037188545929 | -2.933 | 0.09 | 102.053 | 102.273 |
| 91.16772034213463 | -2.978 | 0.219 | 102.775 | 103.001 |
| 91.33506879880998 | -3.023 | 0.342 | 102.93 | 103.162 |
| 91.50241725548533 | -2.881 | 0.271 | 102.305 | 102.543 |
| 91.66976571216065 | -2.72 | 0.064 | 101.854 | 102.092 |
| 91.83711416883601 | -2.888 | -0.032 | 102.563 | 102.801 |
| 92.00446262551137 | -3.113 | -0.026 | 103.414 | 103.658 |
| 92.1718110821867 | -3.107 | -0.013 | 103.272 | 103.504 |
| 92.33915953886203 | -3.043 | -0.297 | 103.375 | 103.6 |
| 92.49721085905541 | -3.165 | -0.432 | 103.961 | 104.187 |
| 92.66455931573077 | -3.275 | -0.541 | 104.213 | 104.426 |
| 92.83190777240611 | -3.178 | -0.709 | 103.678 | 103.878 |
| 92.99925622908145 | -2.888 | -0.819 | 102.189 | 102.369 |
| 93.1666046857568 | -2.823 | -1.115 | 102.047 | 102.221 |
| 93.33395314243214 | -2.778 | -1.296 | 102.24 | 102.401 |
| 93.50130159910749 | -2.946 | -1.437 | 103.065 | 103.214 |
| 93.66865005578283 | -3.049 | -1.579 | 103.704 | 103.839 |
| 93.83599851245818 | -3.133 | -1.586 | 104.032 | 104.161 |
| 94.00334696913353 | -2.785 | -1.773 | 103.169 | 103.285 |
| 94.17069542580886 | -2.817 | -1.76 | 103.446 | 103.568 |
| 94.3380438824842 | -2.849 | -1.753 | 103.839 | 103.955 |
| 94.50539233915954 | -2.74 | -1.889 | 105.554 | 105.67 |
| 94.66344365935292 | -2.675 | -1.985 | 107.281 | 107.397 |
| 94.83079211602828 | -2.875 | -1.882 | 109.067 | 109.176 |
| 94.99814057270362 | -2.746 | -1.966 | 109.221 | 109.331 |
| 95.16548902937897 | -2.501 | -2.082 | 109.337 | 109.447 |
| 95.33283748605432 | -2.669 | -2.024 | 110.704 | 110.82 |
| 95.50018594272963 | -2.823 | -1.947 | 112.045 | 112.161 |
| 95.66753439940499 | -2.965 | -1.85 | 113.018 | 113.134 |
| 95.83488285608034 | -2.746 | -1.863 | 113.115 | 113.231 |
| 96.00223131275567 | -2.675 | -1.818 | 112.715 | 112.825 |
| 96.16957976943102 | -2.688 | -1.644 | 111.929 | 112.032 |
| 96.33692822610638 | -2.546 | -1.541 | 110.794 | 110.897 |
| 96.50427668278171 | -2.482 | -1.483 | 109.383 | 109.492 |
| 96.67162513945706 | -2.398 | -1.566 | 108.184 | 108.3 |
| 96.8389735961324 | -2.585 | -1.463 | 108.048 | 108.171 |
| 96.99702491632577 | -2.926 | -1.238 | 108.474 | 108.596 |
| 97.16437337300111 | -3.165 | -1.102 | 108.093 | 108.222 |
| 97.33172182967647 | -2.862 | -1.102 | 106.508 | 106.624 |
| 97.49907028635181 | -2.714 | -1.115 | 105.128 | 105.251 |
| 97.66641874302715 | -2.572 | -1.315 | 104.741 | 104.87 |
| 97.8337671997025 | -2.669 | -1.379 | 105.077 | 105.218 |
| 98.00111565637785 | -2.785 | -1.425 | 105.47 | 105.618 |
| 98.16846411305319 | -2.901 | -1.386 | 105.927 | 106.082 |
| 98.33581256972855 | -3.023 | -1.431 | 106.295 | 106.443 |
| 98.50316102640389 | -2.959 | -1.863 | 105.96 | 106.102 |
| 98.67050948307921 | -2.798 | -2.469 | 105.915 | 106.056 |
| 98.83785793975456 | -3.01 | -2.54 | 107.578 | 107.719 |
| 99.0052063964299 | -3.049 | -2.765 | 108.886 | 109.022 |
| 99.17255485310525 | -2.946 | -3.055 | 109.763 | 109.892 |
| 99.33060617329863 | -2.714 | -3.217 | 109.292 | 109.421 |
| 99.49795462997399 | -2.527 | -3.339 | 108.648 | 108.777 |
| 99.66530308664933 | -2.424 | -3.416 | 107.881 | 108.016 |
| 99.83265154332467 | -2.52 | -3.442 | 108.306 | 108.448 |
| 100.0 | -2.798 | -3.281 | 109.131 | 109.273 |